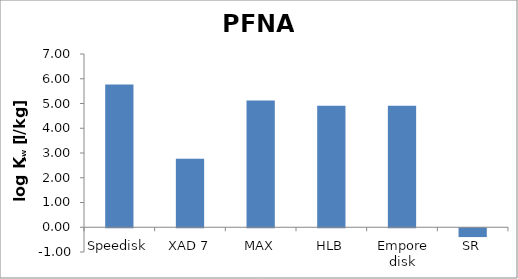
| Category | PFNA |
|---|---|
| Speedisk | 5.764 |
| XAD 7 | 2.771 |
| MAX | 5.123 |
| HLB | 4.906 |
| Empore disk | 4.906 |
| SR | -0.357 |